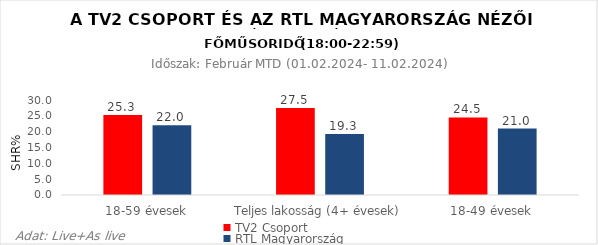
| Category | TV2 Csoport | RTL Magyarország |
|---|---|---|
| 18-59 évesek | 25.3 | 22 |
| Teljes lakosság (4+ évesek) | 27.5 | 19.3 |
| 18-49 évesek | 24.5 | 21 |